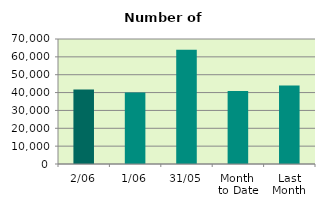
| Category | Series 0 |
|---|---|
| 2/06 | 41696 |
| 1/06 | 40100 |
| 31/05 | 64012 |
| Month 
to Date | 40898 |
| Last
Month | 44009.364 |